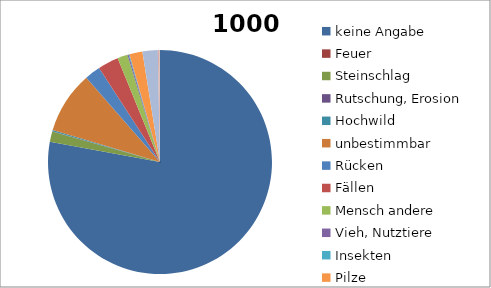
| Category | 1000 Anz |
|---|---|
| keine Angabe | 13041.2 |
| Feuer | 0.5 |
| Steinschlag | 251.5 |
| Rutschung, Erosion | 1.8 |
| Hochwild | 33.9 |
| unbestimmbar | 1499.9 |
| Rücken | 381.3 |
| Fällen | 499.6 |
| Mensch andere | 244.8 |
| Vieh, Nutztiere | 32.4 |
| Insekten | 19.9 |
| Pilze | 313.1 |
| Wind, Schneelast, Raureif | 369.5 |
| Frost, Sonne, Blitz, Trockenheit, Hagel | 44 |
| Vögel | 6.8 |
| Niederwild, Nagetiere | 1.5 |